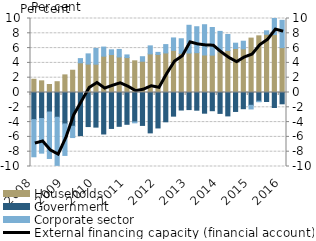
| Category | Households | Government | Corporate sector |
|---|---|---|---|
| 2008.0 | 1.791 | -3.669 | -5.019 |
| 2008.0 | 1.574 | -3.518 | -4.676 |
| 2008.0 | 1.081 | -2.64 | -6.274 |
| 2008.0 | 1.459 | -3.345 | -6.503 |
| 2009.0 | 2.38 | -4.248 | -4.257 |
| 2009.0 | 3.007 | -4.562 | -1.527 |
| 2009.0 | 4.011 | -5.819 | 0.569 |
| 2009.0 | 3.839 | -4.604 | 1.381 |
| 2010.0 | 3.83 | -4.678 | 2.127 |
| 2010.0 | 4.907 | -5.606 | 1.232 |
| 2010.0 | 5.126 | -4.857 | 0.641 |
| 2010.0 | 4.805 | -4.571 | 1.011 |
| 2011.0 | 4.72 | -4.297 | 0.358 |
| 2011.0 | 4.281 | -3.98 | -0.122 |
| 2011.0 | 4.226 | -4.449 | 0.61 |
| 2011.0 | 5.218 | -5.457 | 1.083 |
| 2012.0 | 5.142 | -4.79 | 0.281 |
| 2012.0 | 5.346 | -3.958 | 1.128 |
| 2012.0 | 5.699 | -3.195 | 1.675 |
| 2012.0 | 5.28 | -2.368 | 1.982 |
| 2013.0 | 5.338 | -2.309 | 3.747 |
| 2013.0 | 5.38 | -2.391 | 3.508 |
| 2013.0 | 5.068 | -2.797 | 4.091 |
| 2013.0 | 5.05 | -2.461 | 3.737 |
| 2014.0 | 5.506 | -2.825 | 2.751 |
| 2014.0 | 5.676 | -3.162 | 2.166 |
| 2014.0 | 5.946 | -2.562 | 0.718 |
| 2014.0 | 5.898 | -2.19 | 1.031 |
| 2015.0 | 7.351 | -1.729 | -0.495 |
| 2015.0 | 7.658 | -1.174 | -0.076 |
| 2015.0 | 7.867 | -1.217 | 0.472 |
| 2015.0 | 7.826 | -2.029 | 2.703 |
| 2016.0 | 6.066 | -1.527 | 3.682 |